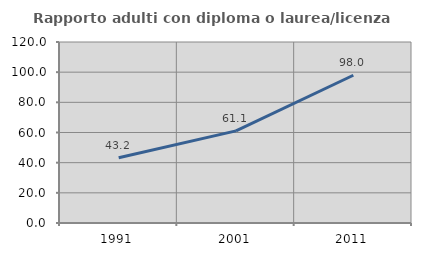
| Category | Rapporto adulti con diploma o laurea/licenza media  |
|---|---|
| 1991.0 | 43.235 |
| 2001.0 | 61.072 |
| 2011.0 | 97.955 |